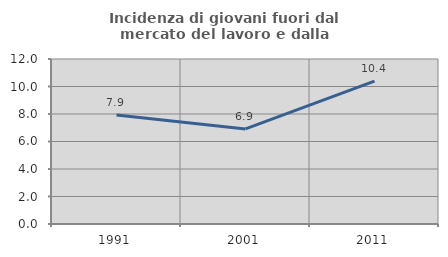
| Category | Incidenza di giovani fuori dal mercato del lavoro e dalla formazione  |
|---|---|
| 1991.0 | 7.925 |
| 2001.0 | 6.911 |
| 2011.0 | 10.396 |